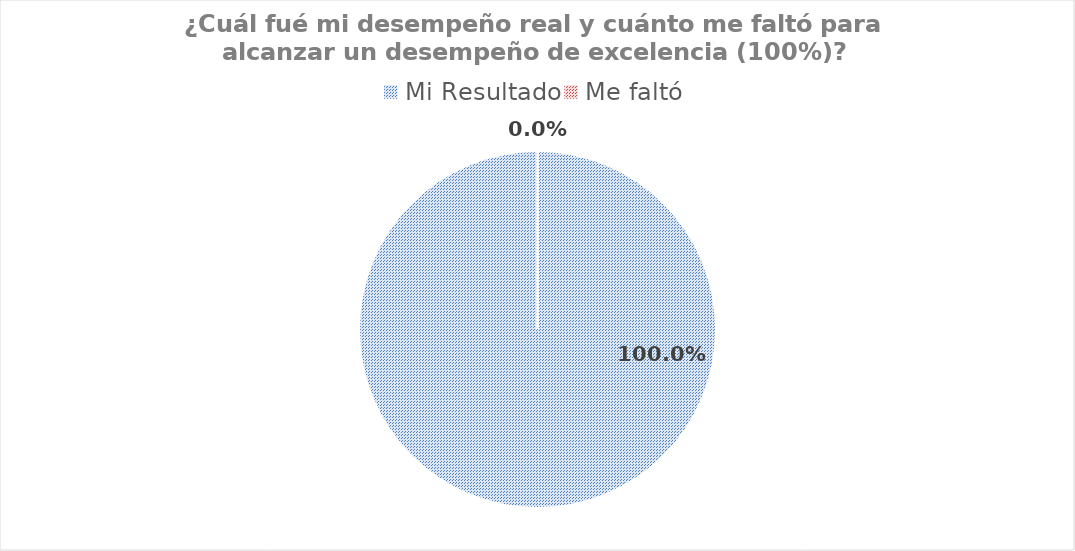
| Category | Series 0 |
|---|---|
| Mi Resultado | 1 |
| Me faltó | 0 |